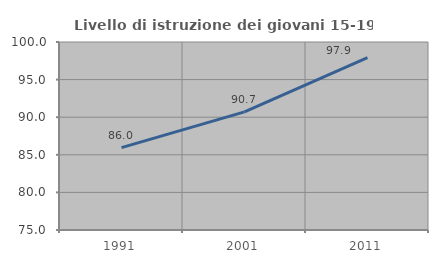
| Category | Livello di istruzione dei giovani 15-19 anni |
|---|---|
| 1991.0 | 85.954 |
| 2001.0 | 90.712 |
| 2011.0 | 97.934 |